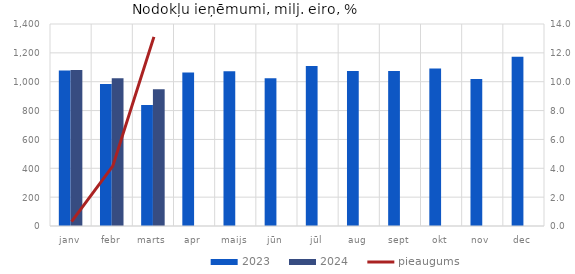
| Category | 2023 | 2024 |
|---|---|---|
| janv | 1077.163 | 1080.454 |
| febr | 983.504 | 1024.284 |
| marts | 838.446 | 948.367 |
| apr | 1063.867 | 0 |
| maijs | 1071.795 | 0 |
| jūn | 1023.215 | 0 |
| jūl | 1108.668 | 0 |
| aug | 1074.853 | 0 |
| sept | 1074.819 | 0 |
| okt | 1092.402 | 0 |
| nov | 1019.074 | 0 |
| dec | 1172.609 | 0 |